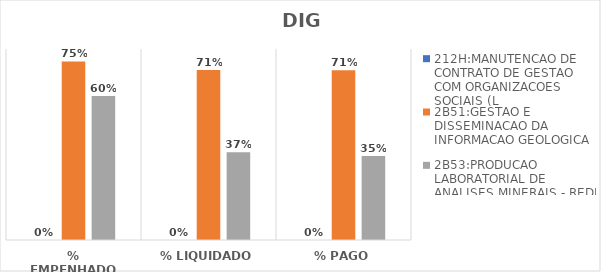
| Category | 212H:MANUTENCAO DE CONTRATO DE GESTAO COM ORGANIZACOES SOCIAIS (L | 2B51:GESTAO E DISSEMINACAO DA INFORMACAO GEOLOGICA | 2B53:PRODUCAO LABORATORIAL DE ANALISES MINERAIS - REDE LAMIN |
|---|---|---|---|
| % EMPENHADO | 0 | 0.748 | 0.603 |
| % LIQUIDADO | 0 | 0.712 | 0.367 |
| % PAGO | 0 | 0.711 | 0.352 |